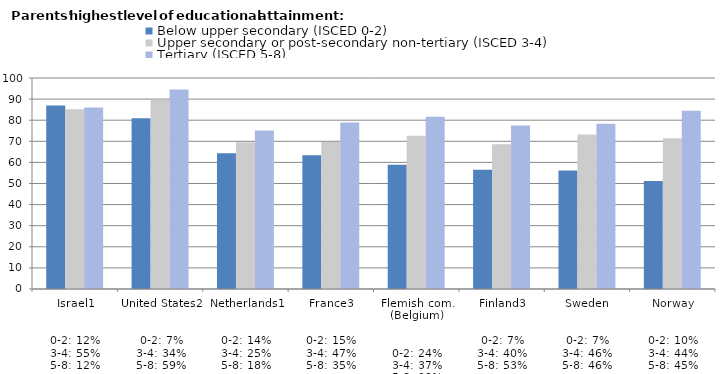
| Category | Below upper secondary (ISCED 0-2) | Upper secondary or post-secondary non-tertiary (ISCED 3-4) | Tertiary (ISCED 5-8) |
|---|---|---|---|
| Israel1


0-2: 12%
3-4: 55%
5-8: 12% | 87.016 | 85.164 | 86.028 |
| United States2


0-2: 7%
3-4: 34%
5-8: 59% | 80.981 | 89.556 | 94.58 |
| Netherlands1


0-2: 14%
3-4: 25%
5-8: 18% | 64.337 | 69.601 | 75.167 |
| France3


0-2: 15%
3-4: 47%
5-8: 35% | 63.395 | 69.63 | 78.931 |
| Flemish com. (Belgium)


0-2: 24%
3-4: 37%
5-8: 38% | 58.888 | 72.613 | 81.591 |
| Finland3


0-2: 7%
3-4: 40%
5-8: 53% | 56.54 | 68.612 | 77.536 |
| Sweden


0-2: 7%
3-4: 46%
5-8: 46% | 56.116 | 73.208 | 78.36 |
| Norway


0-2: 10%
3-4: 44%
5-8: 45% | 51.17 | 71.44 | 84.485 |